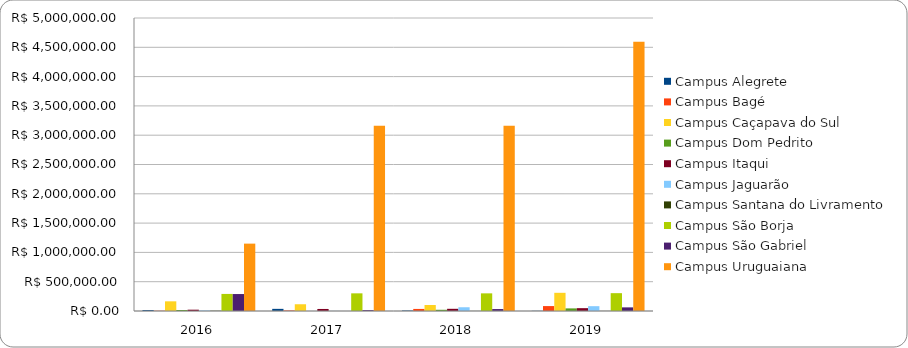
| Category | Campus Alegrete | Campus Bagé | Campus Caçapava do Sul | Campus Dom Pedrito | Campus Itaqui | Campus Jaguarão | Campus Santana do Livramento | Campus São Borja | Campus São Gabriel | Campus Uruguaiana |
|---|---|---|---|---|---|---|---|---|---|---|
| 2016.0 | 15452.5 | 4245 | 165119.68 | 17412.81 | 22310.15 | 8867.96 | 4525 | 291343.51 | 289436.84 | 1149744.99 |
| 2017.0 | 36477.58 | 9085 | 115283.36 | 0 | 34796.92 | 1250 | 519.9 | 301365.88 | 14936 | 3159798.75 |
| 2018.0 | 8215.03 | 35230 | 102178.35 | 20823.45 | 37349.73 | 64000 | 1390 | 301170.99 | 33136.04 | 3159798.75 |
| 2019.0 | 2937 | 84000 | 310500.57 | 44549.85 | 48394.93 | 82372.96 | 1650 | 304473.76 | 61965.68 | 4593516.13 |